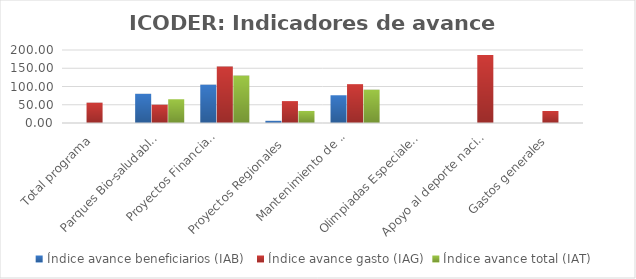
| Category | Índice avance beneficiarios (IAB)  | Índice avance gasto (IAG) | Índice avance total (IAT)  |
|---|---|---|---|
| Total programa | 0 | 55.701 | 0 |
| Parques Bio-saludables | 80 | 50.113 | 65.057 |
| Proyectos Financiados 
a CCDR | 105 | 154.719 | 129.859 |
| Proyectos Regionales  | 6 | 60 | 33 |
| Mantenimiento de 
Instalaciones Deportivas  | 76 | 106.414 | 91.207 |
| Olimpiadas Especiales  | 0 | 0 | 0 |
| Apoyo al deporte nacional | 0 | 186.304 | 0 |
| Gastos generales | 0 | 32.861 | 0 |